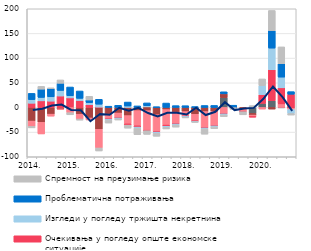
| Category | Други фактори | Трошкови извора за кредите | Конкуренција осталих банака | Очекивања у погледу опште економске ситуације | Изгледи у погледу тржишта некретнина | Проблематична потраживања | Спремност на преузимање ризика |
|---|---|---|---|---|---|---|---|
| 2014. | 0.064 | -27.614 | -10.883 | 8.513 | 7.366 | 12.572 | -2.931 |
|  | 0 | -30.154 | -23.565 | 13.381 | 6.958 | 16.79 | 5.591 |
|  | 0 | -13.58 | -4.04 | 12.84 | 8.698 | 16.68 | 1.322 |
|  | 0 | -3.194 | -0.943 | 23.215 | 11.346 | 14.413 | 6.815 |
| 2015. | 0 | 1.584 | -10.634 | 17.798 | 4.391 | 17.665 | -4.309 |
|  | 0 | -13.709 | -9.748 | 14.011 | 4.433 | 14.906 | -2.291 |
|  | 0 | -21.32 | -4.036 | 5.521 | 4.364 | 5.262 | 7.435 |
|  | 0 | -44.371 | -37.787 | 0.672 | 5.886 | 9.984 | -6.068 |
| 2016. | 0 | -13.683 | -9.865 | -0.183 | -2.017 | 2.537 | -5.896 |
|  | 0 | -11.339 | -9.602 | -0.197 | -1.974 | 4.34 | -2.332 |
|  | 0 | -16.54 | -16.708 | -2.652 | 2.885 | 8.061 | -6.073 |
|  | 0 | -6.439 | -30.804 | -2.596 | -1.957 | 3.101 | -13.396 |
| 2017. | 1.137 | -6.563 | -40.484 | -0.096 | 2.394 | 5.669 | -7.434 |
|  | 0 | -14.708 | -34.121 | -1.211 | -2.234 | 1.309 | -6.144 |
|  | 0 | -4.365 | -31.359 | -2.483 | -2.033 | 8.902 | -3.307 |
|  | 0 | -9.63 | -23.589 | -0.294 | -2.083 | 3.686 | -4.267 |
| 2018. | 0 | -8.401 | -9.465 | -0.308 | -2.087 | 3.545 | -0.758 |
|  | 0 | -13.817 | -13.719 | -0.384 | -1.143 | 1.627 | -1.188 |
|  | 0 | -8.391 | -32.723 | -0.405 | -2.001 | 3.96 | -10.656 |
|  | 0 | -8.386 | -28.581 | -0.415 | -2.043 | 4.097 | -3.682 |
| 2019. | 19.953 | 7.614 | -12.529 | -0.41 | -2.062 | 4.174 | -3.764 |
|  | 0 | -0.003 | 0 | -0.494 | 0 | 4.55 | -3.594 |
|  | 0 | -3.529 | -4.583 | -0.546 | 0 | 0 | -6.275 |
|  | -12.056 | -3.387 | -3.387 | -0.556 | 0 | 0 | 3.746 |
| 2020. | 8.2 | 0 | -3.3 | 17.776 | 18.324 | 0 | 13.5 |